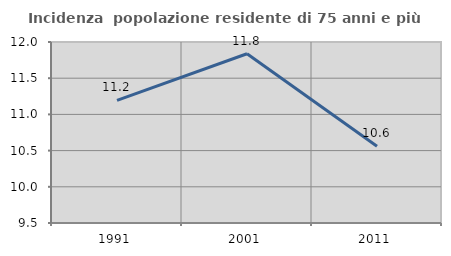
| Category | Incidenza  popolazione residente di 75 anni e più |
|---|---|
| 1991.0 | 11.193 |
| 2001.0 | 11.838 |
| 2011.0 | 10.561 |